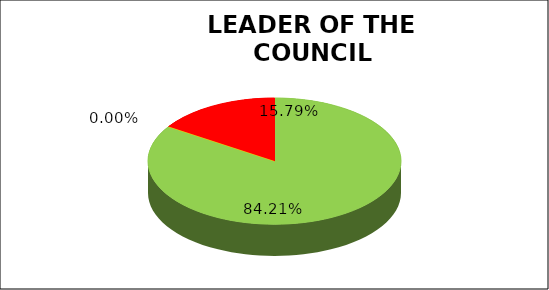
| Category | Q3 |
|---|---|
| Green | 0.842 |
| Amber | 0 |
| Red | 0.158 |